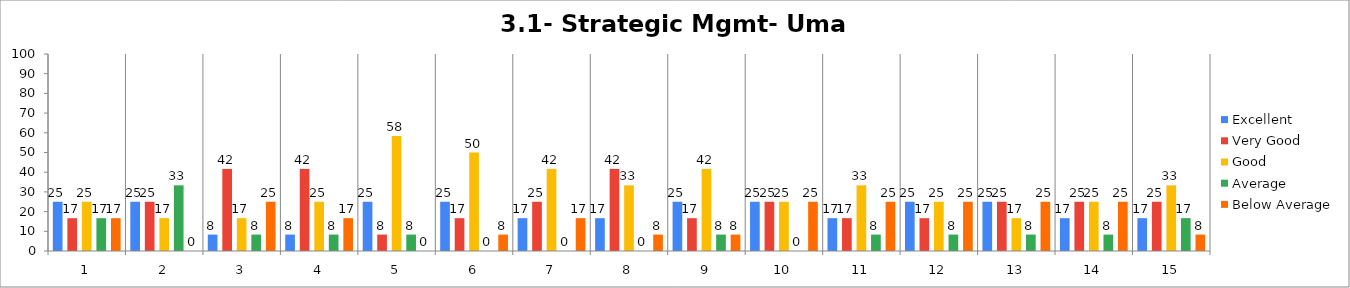
| Category | Excellent | Very Good | Good | Average | Below Average |
|---|---|---|---|---|---|
| 0 | 25 | 16.667 | 25 | 16.667 | 16.667 |
| 1 | 25 | 25 | 16.667 | 33.333 | 0 |
| 2 | 8.333 | 41.667 | 16.667 | 8.333 | 25 |
| 3 | 8.333 | 41.667 | 25 | 8.333 | 16.667 |
| 4 | 25 | 8.333 | 58.333 | 8.333 | 0 |
| 5 | 25 | 16.667 | 50 | 0 | 8.333 |
| 6 | 16.667 | 25 | 41.667 | 0 | 16.667 |
| 7 | 16.667 | 41.667 | 33.333 | 0 | 8.333 |
| 8 | 25 | 16.667 | 41.667 | 8.333 | 8.333 |
| 9 | 25 | 25 | 25 | 0 | 25 |
| 10 | 16.667 | 16.667 | 33.333 | 8.333 | 25 |
| 11 | 25 | 16.667 | 25 | 8.333 | 25 |
| 12 | 25 | 25 | 16.667 | 8.333 | 25 |
| 13 | 16.667 | 25 | 25 | 8.333 | 25 |
| 14 | 16.667 | 25 | 33.333 | 16.667 | 8.333 |